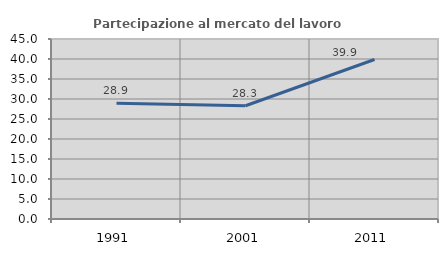
| Category | Partecipazione al mercato del lavoro  femminile |
|---|---|
| 1991.0 | 28.923 |
| 2001.0 | 28.317 |
| 2011.0 | 39.869 |